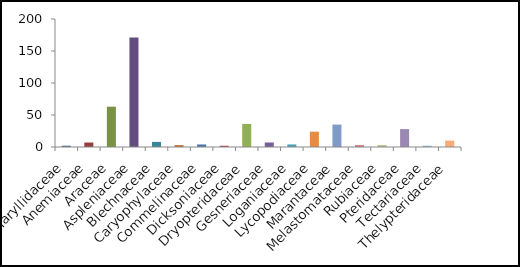
| Category | Quantidade |
|---|---|
| Amaryllidaceae | 2 |
| Anemiaceae | 7 |
| Araceae | 63 |
| Aspleniaceae | 171 |
| Blechnaceae | 8 |
| Caryophylaceae | 3 |
| Commelinaceae | 4 |
| Dicksoniaceae | 2 |
| Dryopteridaceae | 36 |
| Gesneriaceae | 7 |
| Loganiaceae | 4 |
| Lycopodiaceae | 24 |
| Marantaceae | 35 |
| Melastomataceae | 3 |
| Rubiaceae | 3 |
| Pteridaceae | 28 |
| Tectariaceae | 2 |
| Thelypteridaceae | 10 |